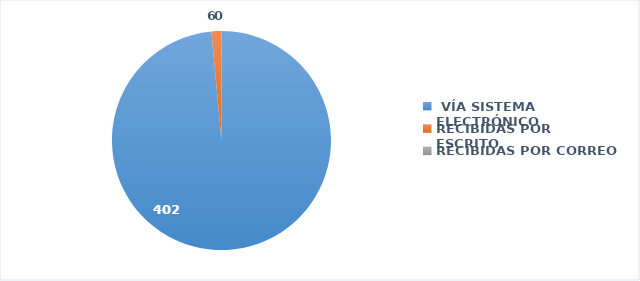
| Category | SOLICITUDES RECIBIDAS |
|---|---|
|  VÍA SISTEMA ELECTRÓNICO | 402 |
| RECIBIDAS POR ESCRITO | 6 |
| RECIBIDAS POR CORREO | 0 |